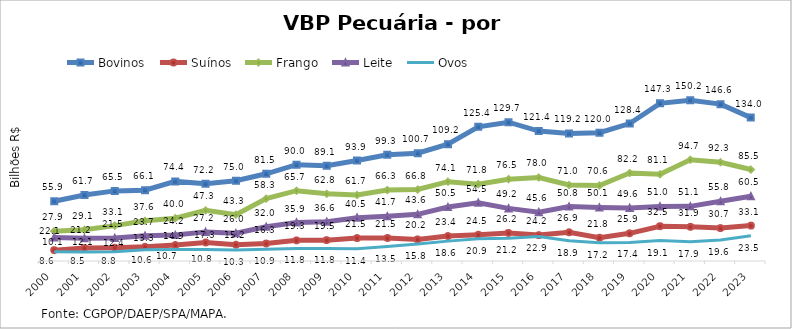
| Category | Bovinos | Suínos | Frango | Leite | Ovos |
|---|---|---|---|---|---|
| 2000 | 55.858 | 10.114 | 27.902 | 22.063 | 8.627 |
| 2001 | 61.746 | 12.134 | 29.118 | 21.231 | 8.501 |
| 2002 | 65.524 | 12.436 | 33.066 | 21.498 | 8.758 |
| 2003 | 66.131 | 13.291 | 37.643 | 23.674 | 10.594 |
| 2004 | 74.405 | 14.943 | 39.997 | 24.196 | 10.737 |
| 2005 | 72.237 | 17.326 | 47.339 | 27.214 | 10.81 |
| 2006 | 74.999 | 15.24 | 43.309 | 25.994 | 10.269 |
| 2007 | 81.507 | 16.297 | 58.31 | 31.956 | 10.913 |
| 2008 | 89.993 | 19.297 | 65.697 | 35.948 | 11.786 |
| 2009 | 89.055 | 19.506 | 62.8 | 36.65 | 11.752 |
| 2010 | 93.89 | 21.459 | 61.671 | 40.474 | 11.43 |
| 2011 | 99.257 | 21.492 | 66.335 | 41.724 | 13.468 |
| 2012 | 100.736 | 20.18 | 66.802 | 43.6 | 15.788 |
| 2013 | 109.162 | 23.366 | 74.112 | 50.454 | 18.569 |
| 2014 | 125.408 | 24.542 | 71.837 | 54.484 | 20.863 |
| 2015 | 129.724 | 26.227 | 76.467 | 49.181 | 21.243 |
| 2016 | 121.428 | 24.204 | 78.044 | 45.634 | 22.901 |
| 2017 | 119.16 | 26.869 | 70.985 | 50.846 | 18.876 |
| 2018 | 119.959 | 21.76 | 70.572 | 50.09 | 17.165 |
| 2019 | 128.449 | 25.864 | 82.242 | 49.626 | 17.384 |
| 2020 | 147.339 | 32.511 | 81.119 | 51.022 | 19.091 |
| 2021 | 150.247 | 31.932 | 94.673 | 51.079 | 17.89 |
| 2022 | 146.61 | 30.747 | 92.275 | 55.768 | 19.598 |
| 2023 | 134.01 | 33.069 | 85.484 | 60.505 | 23.529 |